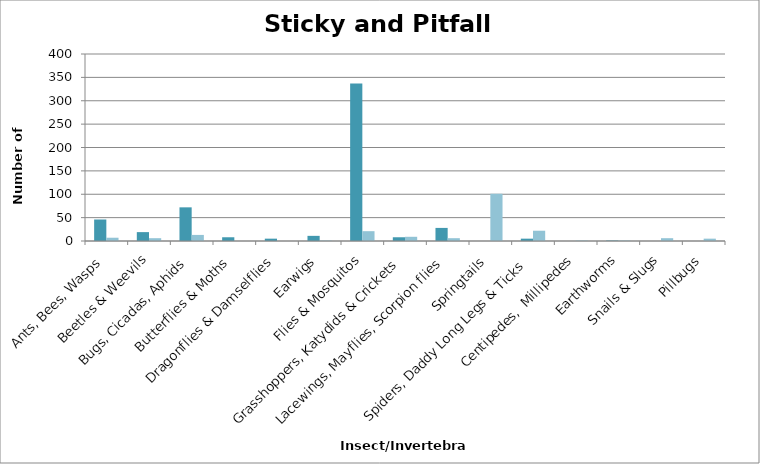
| Category | Sticky Trap Sum Both Schools | Pitfall Trap Sum Both Schools |
|---|---|---|
| Ants, Bees, Wasps | 46 | 7 |
| Beetles & Weevils | 19 | 6 |
| Bugs, Cicadas, Aphids | 72 | 13 |
| Butterflies & Moths | 8 | 0 |
| Dragonflies & Damselflies | 5 | 0 |
| Earwigs | 11 | 1 |
| Flies & Mosquitos | 337 | 21 |
| Grasshoppers, Katydids & Crickets | 8 | 9 |
| Lacewings, Mayflies, Scorpion flies | 28 | 6 |
| Springtails | 0 | 101 |
| Spiders, Daddy Long Legs & Ticks | 5 | 22 |
| Centipedes,  Millipedes | 0 | 1 |
| Earthworms | 1 | 1 |
| Snails & Slugs | 0 | 6 |
| Pillbugs | 0 | 5 |